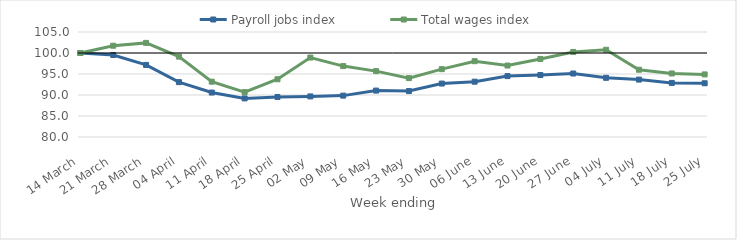
| Category | Payroll jobs index | Total wages index |
|---|---|---|
| 2020-03-14 | 100 | 100 |
| 2020-03-21 | 99.527 | 101.73 |
| 2020-03-28 | 97.16 | 102.408 |
| 2020-04-04 | 93.06 | 99.137 |
| 2020-04-11 | 90.587 | 93.173 |
| 2020-04-18 | 89.189 | 90.688 |
| 2020-04-25 | 89.534 | 93.75 |
| 2020-05-02 | 89.665 | 98.917 |
| 2020-05-09 | 89.852 | 96.881 |
| 2020-05-16 | 91.051 | 95.681 |
| 2020-05-23 | 90.935 | 94.024 |
| 2020-05-30 | 92.724 | 96.155 |
| 2020-06-06 | 93.169 | 98.053 |
| 2020-06-13 | 94.497 | 97.011 |
| 2020-06-20 | 94.75 | 98.585 |
| 2020-06-27 | 95.112 | 100.252 |
| 2020-07-04 | 94.095 | 100.76 |
| 2020-07-11 | 93.672 | 96.016 |
| 2020-07-18 | 92.874 | 95.129 |
| 2020-07-25 | 92.793 | 94.902 |